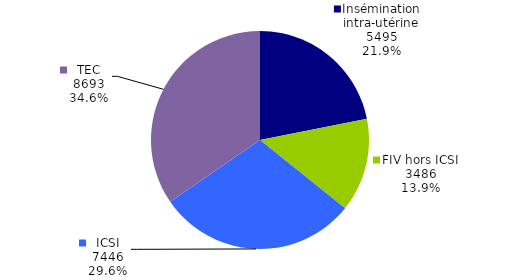
| Category | Enfants nés vivants |
|---|---|
| Insémination intra-utérine | 5495 |
| FIV hors ICSI | 3486 |
| ICSI | 7446 |
| TEC | 8693 |